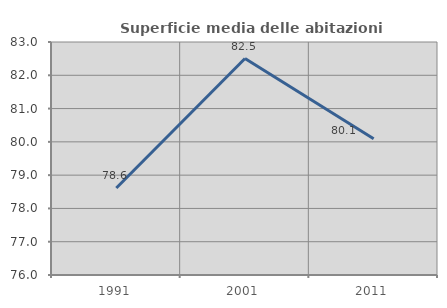
| Category | Superficie media delle abitazioni occupate |
|---|---|
| 1991.0 | 78.613 |
| 2001.0 | 82.504 |
| 2011.0 | 80.092 |